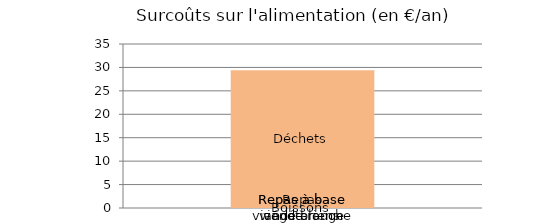
| Category | Repas végétariens | Repas à base viande rouge | Repas à base viande blanche | Boissons | Déchets |
|---|---|---|---|---|---|
| surcoûts en € | 0 | 0 | 0 | 0 | 29.404 |